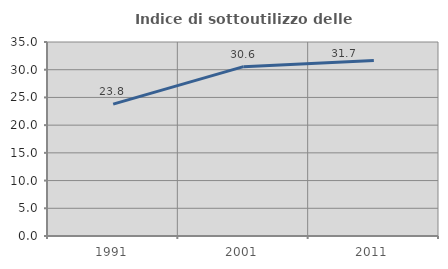
| Category | Indice di sottoutilizzo delle abitazioni  |
|---|---|
| 1991.0 | 23.802 |
| 2001.0 | 30.552 |
| 2011.0 | 31.651 |